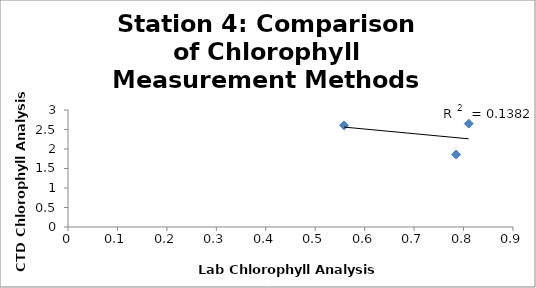
| Category | Series 0 |
|---|---|
| 0.7848571926936965 | 1.858 |
| 0.8104590583065385 | 2.65 |
| 0.5584406936801224 | 2.606 |